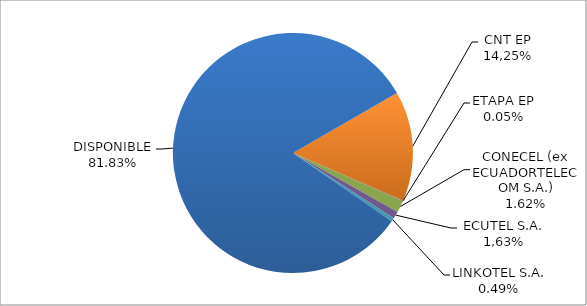
| Category | CODIGO DE AREA 4 |
|---|---|
| CORPORACIÓN NACIONAL TELECOMUNICACIONES CNT EP | 0.148 |
| ETAPA EP | 0.001 |
| CONECEL (ex ECUADORTELECOM S.A.) | 0.016 |
| SETEL S.A. | 0.01 |
| LINKOTEL S.A. | 0.005 |
| DISPONIBLE | 0.818 |